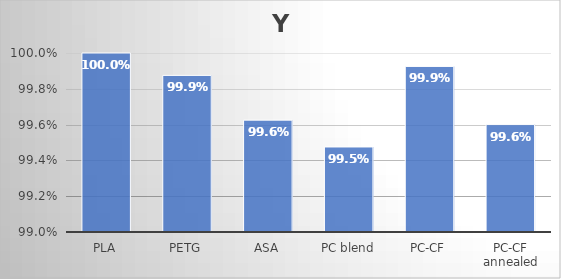
| Category | Y |
|---|---|
| PLA | 1 |
| PETG | 0.999 |
| ASA | 0.996 |
| PC blend | 0.995 |
| PC-CF | 0.999 |
| PC-CF annealed | 0.996 |